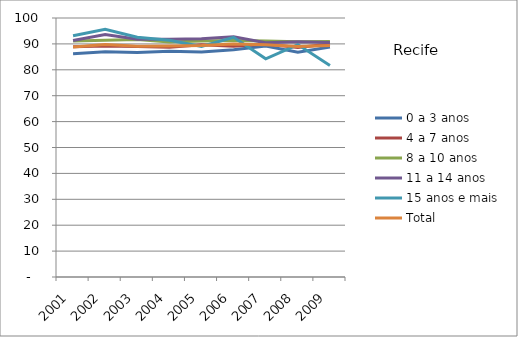
| Category | 0 a 3 anos | 4 a 7 anos | 8 a 10 anos | 11 a 14 anos | 15 anos e mais | Total |
|---|---|---|---|---|---|---|
| 2001.0 | 86.15 | 88.89 | 91.09 | 91.33 | 93.12 | 88.77 |
| 2002.0 | 86.94 | 89.18 | 91.39 | 93.65 | 95.66 | 89.79 |
| 2003.0 | 86.64 | 88.95 | 91.67 | 91.77 | 92.6 | 89.12 |
| 2004.0 | 87.19 | 88.73 | 90.77 | 91.84 | 91.44 | 89.22 |
| 2005.0 | 86.91 | 89.69 | 91.11 | 91.96 | 88.98 | 89.4 |
| 2006.0 | 87.78 | 89.05 | 91.3 | 92.79 | 92.55 | 90 |
| 2007.0 | 89.21 | 89.97 | 91.16 | 90.41 | 84.23 | 89.69 |
| 2008.0 | 86.77 | 88.62 | 90.86 | 90.85 | 89.73 | 88.97 |
| 2009.0 | 88.82 | 89.93 | 90.96 | 90.54 | 81.63 | 89.35 |